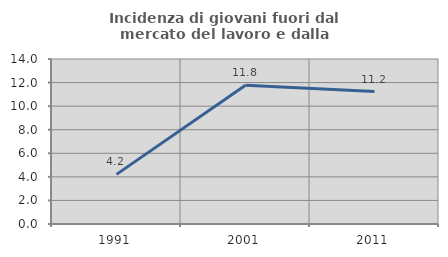
| Category | Incidenza di giovani fuori dal mercato del lavoro e dalla formazione  |
|---|---|
| 1991.0 | 4.211 |
| 2001.0 | 11.765 |
| 2011.0 | 11.236 |